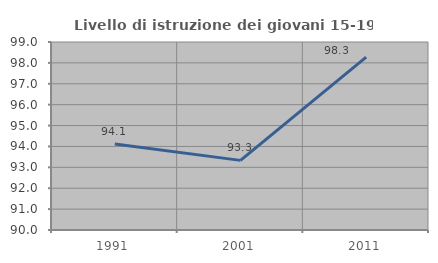
| Category | Livello di istruzione dei giovani 15-19 anni |
|---|---|
| 1991.0 | 94.118 |
| 2001.0 | 93.333 |
| 2011.0 | 98.276 |